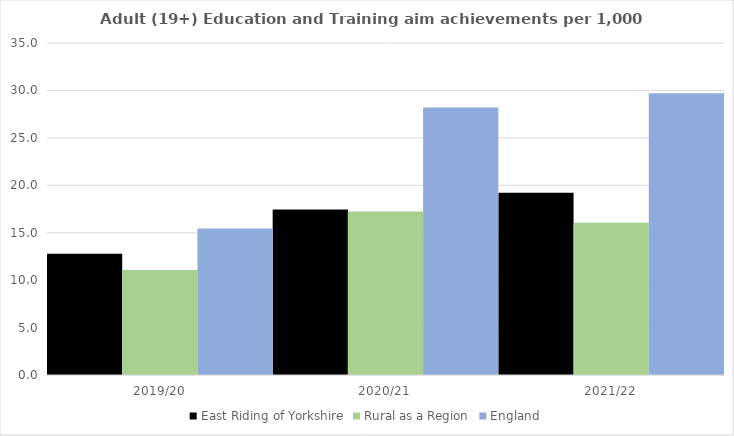
| Category | East Riding of Yorkshire | Rural as a Region | England |
|---|---|---|---|
| 2019/20 | 12.785 | 11.081 | 15.446 |
| 2020/21 | 17.44 | 17.224 | 28.211 |
| 2021/22 | 19.205 | 16.063 | 29.711 |